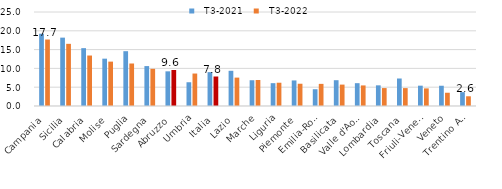
| Category |   T3-2021 |   T3-2022 |
|---|---|---|
|   Campania | 19.223 | 17.683 |
|   Sicilia | 18.181 | 16.535 |
|   Calabria | 15.387 | 13.425 |
|   Molise | 12.588 | 11.803 |
|   Puglia | 14.577 | 11.303 |
|   Sardegna | 10.617 | 9.888 |
|   Abruzzo | 9.219 | 9.583 |
|   Umbria | 6.317 | 8.634 |
| Italia | 9.006 | 7.843 |
|   Lazio | 9.362 | 7.55 |
|   Marche | 6.853 | 6.916 |
|   Liguria | 6.071 | 6.192 |
|   Piemonte | 6.8 | 5.923 |
|   Emilia-Romagna | 4.465 | 5.887 |
|   Basilicata | 6.861 | 5.691 |
|   Valle d'Aosta | 6.069 | 5.474 |
|   Lombardia | 5.499 | 4.766 |
|   Toscana | 7.313 | 4.758 |
|   Friuli-Venezia Giulia | 5.408 | 4.684 |
|   Veneto | 5.388 | 3.526 |
|   Trentino Alto Adige | 3.682 | 2.584 |